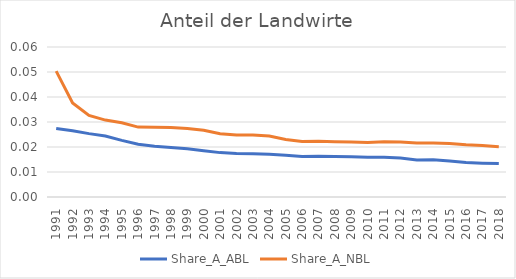
| Category | Share_A_ABL | Share_A_NBL |
|---|---|---|
| 1991.0 | 0.027 | 0.05 |
| 1992.0 | 0.026 | 0.038 |
| 1993.0 | 0.025 | 0.033 |
| 1994.0 | 0.024 | 0.031 |
| 1995.0 | 0.023 | 0.03 |
| 1996.0 | 0.021 | 0.028 |
| 1997.0 | 0.02 | 0.028 |
| 1998.0 | 0.02 | 0.028 |
| 1999.0 | 0.019 | 0.027 |
| 2000.0 | 0.018 | 0.027 |
| 2001.0 | 0.018 | 0.025 |
| 2002.0 | 0.017 | 0.025 |
| 2003.0 | 0.017 | 0.025 |
| 2004.0 | 0.017 | 0.024 |
| 2005.0 | 0.017 | 0.023 |
| 2006.0 | 0.016 | 0.022 |
| 2007.0 | 0.016 | 0.022 |
| 2008.0 | 0.016 | 0.022 |
| 2009.0 | 0.016 | 0.022 |
| 2010.0 | 0.016 | 0.022 |
| 2011.0 | 0.016 | 0.022 |
| 2012.0 | 0.016 | 0.022 |
| 2013.0 | 0.015 | 0.022 |
| 2014.0 | 0.015 | 0.022 |
| 2015.0 | 0.014 | 0.021 |
| 2016.0 | 0.014 | 0.021 |
| 2017.0 | 0.014 | 0.021 |
| 2018.0 | 0.013 | 0.02 |